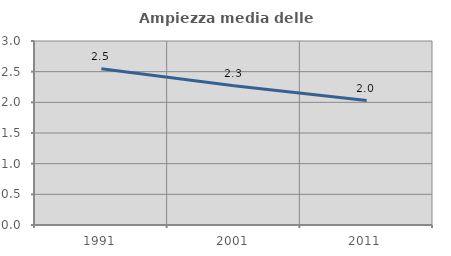
| Category | Ampiezza media delle famiglie |
|---|---|
| 1991.0 | 2.547 |
| 2001.0 | 2.269 |
| 2011.0 | 2.028 |